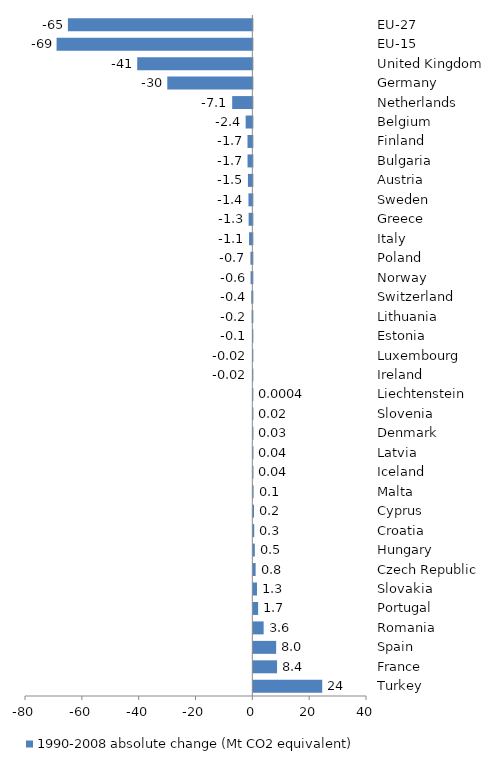
| Category | 1990-2008 absolute change (Mt CO2 equivalent) |
|---|---|
| EU-27 | -64.903 |
| EU-15 | -68.892 |
| United Kingdom | -40.516 |
| Germany | -29.929 |
| Netherlands | -7.093 |
| Belgium | -2.354 |
| Finland | -1.699 |
| Bulgaria | -1.693 |
| Austria | -1.548 |
| Sweden | -1.363 |
| Greece | -1.304 |
| Italy | -1.149 |
| Poland | -0.664 |
| Norway | -0.612 |
| Switzerland | -0.363 |
| Lithuania | -0.222 |
| Estonia | -0.08 |
| Luxembourg | -0.019 |
| Ireland | -0.015 |
| Liechtenstein | 0 |
| Slovenia | 0.016 |
| Denmark | 0.031 |
| Latvia | 0.039 |
| Iceland | 0.041 |
| Malta | 0.097 |
| Cyprus | 0.241 |
| Croatia | 0.32 |
| Hungary | 0.522 |
| Czech Republic | 0.804 |
| Slovakia | 1.295 |
| Portugal | 1.684 |
| Romania | 3.633 |
| Spain | 8.032 |
| France | 8.351 |
| Turkey | 24.241 |